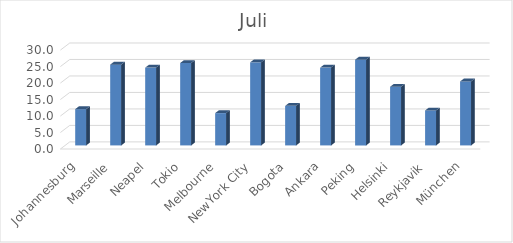
| Category | Juli |
|---|---|
| Johannesburg | 11 |
| Marseille | 24.5 |
| Neapel | 23.6 |
| Tokio | 25 |
| Melbourne | 9.8 |
| NewYork City | 25.2 |
| Bogota | 12 |
| Ankara | 23.6 |
| Peking | 26 |
| Helsinki | 17.8 |
| Reykjavik | 10.6 |
| München | 19.4 |